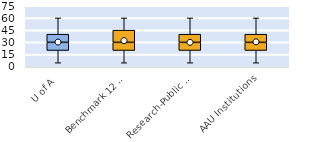
| Category | 25th | 50th | 75th |
|---|---|---|---|
| U of A | 20 | 10 | 10 |
| Benchmark 12 & SEC | 20 | 10 | 15 |
| Research-Public Univ | 20 | 10 | 10 |
| AAU Institutions | 20 | 10 | 10 |